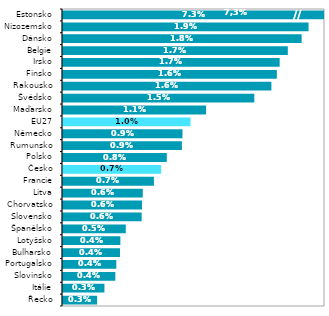
| Category | 2020* |
|---|---|
| Řecko | 0.003 |
| Itálie | 0.003 |
| Slovinsko | 0.004 |
| Portugalsko | 0.004 |
| Bulharsko | 0.004 |
| Lotyšsko | 0.004 |
| Španělsko | 0.005 |
| Slovensko | 0.006 |
| Chorvatsko | 0.006 |
| Litva | 0.006 |
| Francie | 0.007 |
| Česko | 0.007 |
| Polsko | 0.008 |
| Rumunsko | 0.009 |
| Německo | 0.009 |
| EU27 | 0.01 |
| Maďarsko | 0.011 |
| Švédsko | 0.015 |
| Rakousko | 0.016 |
| Finsko | 0.016 |
| Irsko | 0.017 |
| Belgie | 0.017 |
| Dánsko | 0.018 |
| Nizozemsko | 0.019 |
| Estonsko | 0.073 |